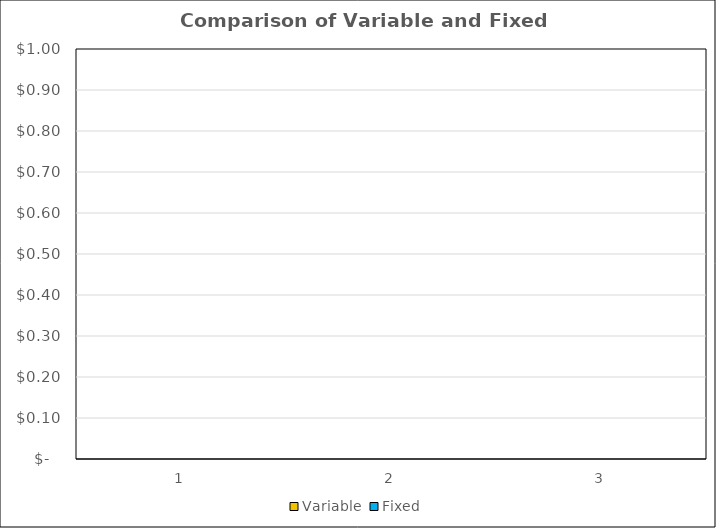
| Category | Variable | Fixed | Variable & Fixed |
|---|---|---|---|
| 0 | 0 | 0 |  |
| 1 | 0 | 0 |  |
| 2 | 0 | 0 |  |